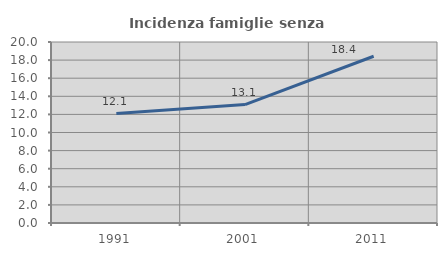
| Category | Incidenza famiglie senza nuclei |
|---|---|
| 1991.0 | 12.091 |
| 2001.0 | 13.09 |
| 2011.0 | 18.428 |